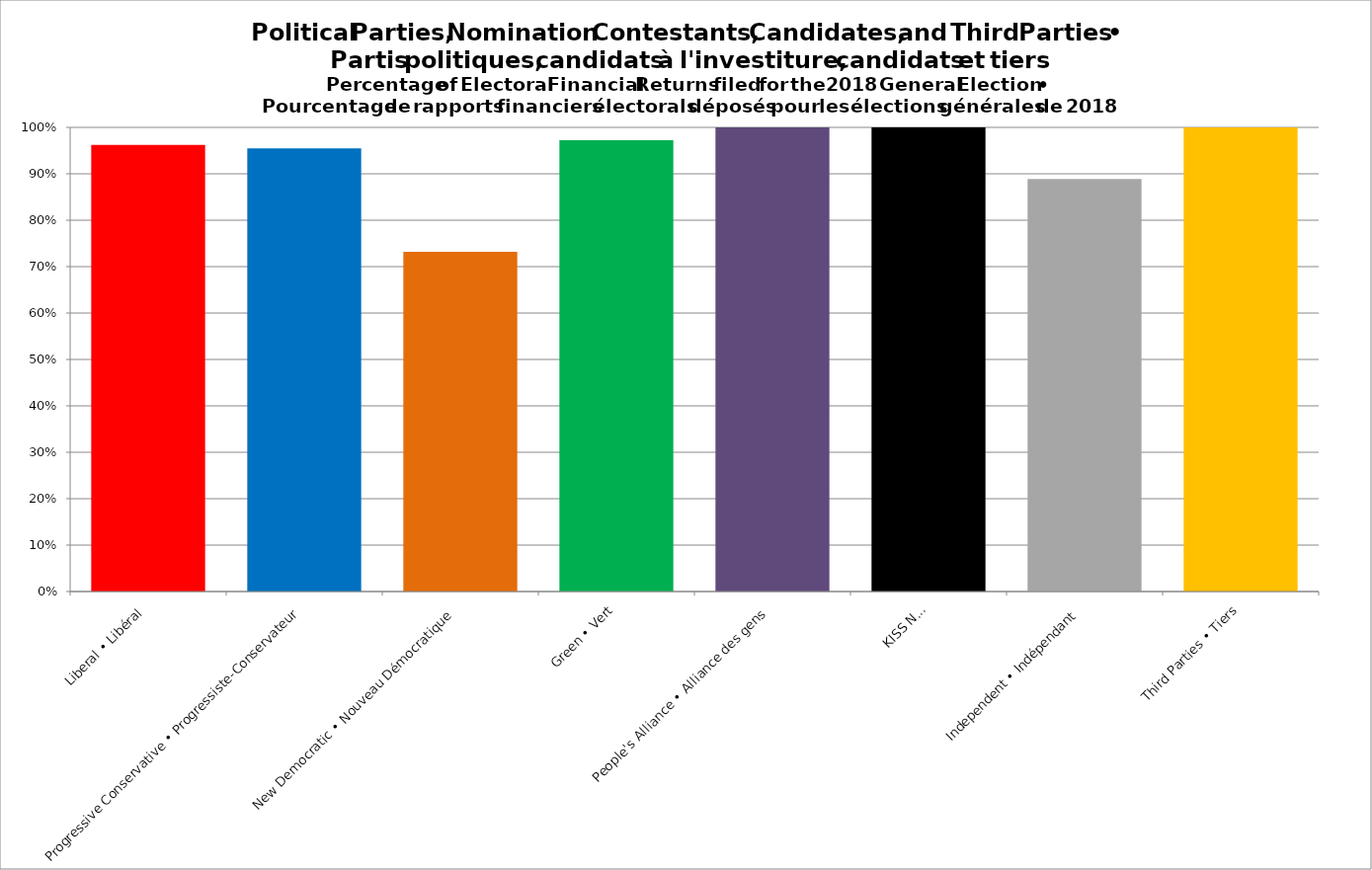
| Category | Series 0 | Series 2 | Series 4 |
|---|---|---|---|
| Liberal • Libéral | 0.962 |  |  |
| Progressive Conservative • Progressiste-Conservateur | 0.955 |  |  |
| New Democratic • Nouveau Démocratique | 0.732 |  |  |
| Green • Vert | 0.972 |  |  |
| People's Alliance • Alliance des gens | 1 |  |  |
| KISS N.B. | 1 |  |  |
| Independent • Indépendant | 0.889 |  |  |
| Third Parties • Tiers | 1 |  |  |